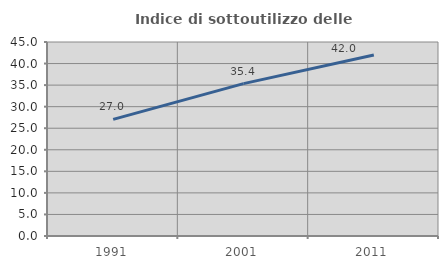
| Category | Indice di sottoutilizzo delle abitazioni  |
|---|---|
| 1991.0 | 27.048 |
| 2001.0 | 35.352 |
| 2011.0 | 41.983 |